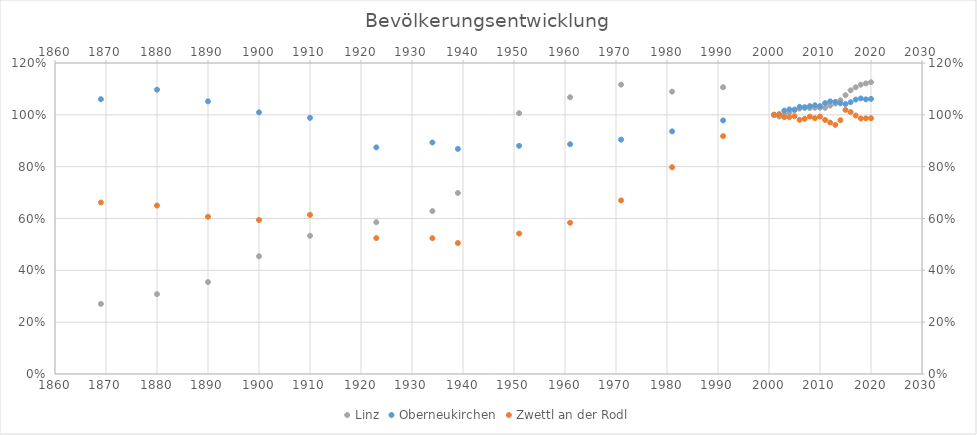
| Category | Linz |
|---|---|
| 2020.0 | 1.126 |
| 2019.0 | 1.121 |
| 2018.0 | 1.116 |
| 2017.0 | 1.106 |
| 2016.0 | 1.094 |
| 2015.0 | 1.076 |
| 2014.0 | 1.056 |
| 2013.0 | 1.044 |
| 2012.0 | 1.036 |
| 2011.0 | 1.027 |
| 2010.0 | 1.027 |
| 2009.0 | 1.027 |
| 2008.0 | 1.026 |
| 2007.0 | 1.027 |
| 2006.0 | 1.024 |
| 2005.0 | 1.018 |
| 2004.0 | 1.009 |
| 2003.0 | 1.002 |
| 2002.0 | 0.993 |
| 2001.0 | 1 |
| 1991.0 | 1.106 |
| 1981.0 | 1.089 |
| 1971.0 | 1.117 |
| 1961.0 | 1.068 |
| 1951.0 | 1.006 |
| 1939.0 | 0.698 |
| 1934.0 | 0.629 |
| 1923.0 | 0.586 |
| 1910.0 | 0.533 |
| 1900.0 | 0.454 |
| 1890.0 | 0.355 |
| 1880.0 | 0.308 |
| 1869.0 | 0.27 |